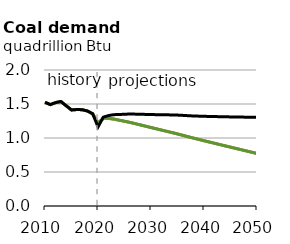
| Category | EAC | DAC | Reference |
|---|---|---|---|
| 2010.0 | 1.525 | 1.525 | 1.525 |
| 2011.0 | 1.491 | 1.491 | 1.491 |
| 2012.0 | 1.52 | 1.52 | 1.52 |
| 2013.0 | 1.536 | 1.536 | 1.536 |
| 2014.0 | 1.474 | 1.474 | 1.474 |
| 2015.0 | 1.412 | 1.412 | 1.412 |
| 2016.0 | 1.419 | 1.419 | 1.419 |
| 2017.0 | 1.416 | 1.416 | 1.416 |
| 2018.0 | 1.397 | 1.397 | 1.397 |
| 2019.0 | 1.355 | 1.355 | 1.356 |
| 2020.0 | 1.218 | 1.218 | 1.162 |
| 2021.0 | 1.291 | 1.291 | 1.307 |
| 2022.0 | 1.288 | 1.288 | 1.33 |
| 2023.0 | 1.278 | 1.278 | 1.343 |
| 2024.0 | 1.262 | 1.262 | 1.345 |
| 2025.0 | 1.246 | 1.246 | 1.35 |
| 2026.0 | 1.23 | 1.23 | 1.352 |
| 2027.0 | 1.211 | 1.211 | 1.351 |
| 2028.0 | 1.192 | 1.192 | 1.349 |
| 2029.0 | 1.173 | 1.173 | 1.347 |
| 2030.0 | 1.154 | 1.154 | 1.345 |
| 2031.0 | 1.135 | 1.135 | 1.343 |
| 2032.0 | 1.116 | 1.116 | 1.341 |
| 2033.0 | 1.098 | 1.098 | 1.341 |
| 2034.0 | 1.079 | 1.079 | 1.339 |
| 2035.0 | 1.06 | 1.06 | 1.337 |
| 2036.0 | 1.039 | 1.039 | 1.333 |
| 2037.0 | 1.019 | 1.019 | 1.328 |
| 2038.0 | 0.999 | 0.999 | 1.324 |
| 2039.0 | 0.979 | 0.979 | 1.321 |
| 2040.0 | 0.96 | 0.96 | 1.319 |
| 2041.0 | 0.941 | 0.941 | 1.317 |
| 2042.0 | 0.922 | 0.922 | 1.315 |
| 2043.0 | 0.903 | 0.903 | 1.313 |
| 2044.0 | 0.884 | 0.884 | 1.312 |
| 2045.0 | 0.866 | 0.866 | 1.31 |
| 2046.0 | 0.847 | 0.847 | 1.309 |
| 2047.0 | 0.828 | 0.828 | 1.308 |
| 2048.0 | 0.81 | 0.81 | 1.306 |
| 2049.0 | 0.791 | 0.791 | 1.305 |
| 2050.0 | 0.772 | 0.772 | 1.304 |